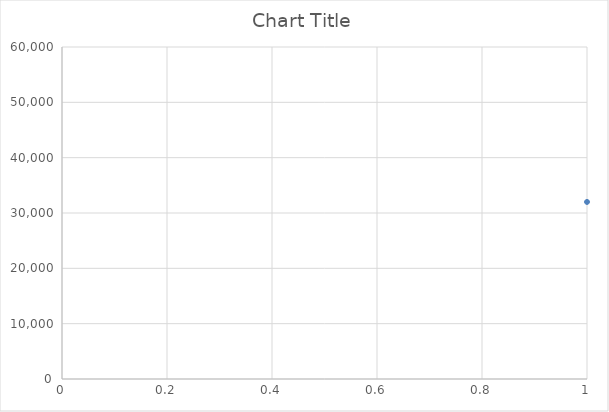
| Category | Series 0 |
|---|---|
| 0 | 32000 |
| 1 | 32200 |
| 2 | 30000 |
| 3 | 32600 |
| 4 | 32800 |
| 5 | 30800 |
| 6 | 41500 |
| 7 | 41000 |
| 8 | 41500 |
| 9 | 41000 |
| 10 | 50500 |
| 11 | 31800 |
| 12 | 31400 |
| 13 | 31000 |
| 14 | 31800 |
| 15 | 42000 |
| 16 | 43500 |
| 17 | 31600 |
| 18 | 31600 |
| 19 | 31000 |
| 20 | 31600 |
| 21 | 31800 |
| 22 | 31400 |
| 23 | 31000 |
| 24 | 31800 |
| 25 | 42500 |
| 26 | 44500 |
| 27 | 42000 |
| 28 | 43500 |
| 29 | 9800 |
| 30 | 9800 |
| 31 | 12000 |
| 32 | 18000 |
| 33 | 25000 |
| 34 | 23600 |
| 35 | 24000 |
| 36 | 23800 |
| 37 | 24000 |
| 38 | 24000 |
| 39 | 24000 |
| 40 | 24000 |
| 41 | 23800 |
| 42 | 23800 |
| 43 | 23600 |
| 44 | 23200 |
| 45 | 23200 |
| 46 | 23000 |
| 47 | 22800 |
| 48 | 22800 |
| 49 | 22600 |
| 50 | 24000 |
| 51 | 24000 |
| 52 | 24000 |
| 53 | 24000 |
| 54 | 23400 |
| 55 | 23400 |
| 56 | 23600 |
| 57 | 23400 |
| 58 | 23400 |
| 59 | 23200 |
| 60 | 23200 |
| 61 | 23400 |
| 62 | 24000 |
| 63 | 23800 |
| 64 | 23800 |
| 65 | 23800 |
| 66 | 23800 |
| 67 | 23600 |
| 68 | 23400 |
| 69 | 23400 |
| 70 | 23200 |
| 71 | 23600 |
| 72 | 23400 |
| 73 | 23400 |
| 74 | 23200 |
| 75 | 23000 |
| 76 | 23000 |
| 77 | 23000 |
| 78 | 23000 |
| 79 | 23000 |
| 80 | 23000 |
| 81 | 23000 |
| 82 | 23000 |
| 83 | 22800 |
| 84 | 22800 |
| 85 | 22800 |
| 86 | 22800 |
| 87 | 22800 |
| 88 | 22800 |
| 89 | 23000 |
| 90 | 23000 |
| 91 | 23000 |
| 92 | 23000 |
| 93 | 23000 |
| 94 | 23000 |
| 95 | 23400 |
| 96 | 23400 |
| 97 | 23400 |
| 98 | 23400 |
| 99 | 23200 |
| 100 | 23200 |
| 101 | 23200 |
| 102 | 23000 |
| 103 | 23000 |
| 104 | 23400 |
| 105 | 23200 |
| 106 | 23200 |
| 107 | 23200 |
| 108 | 23200 |
| 109 | 23200 |
| 110 | 23200 |
| 111 | 23200 |
| 112 | 23000 |
| 113 | 23200 |
| 114 | 23000 |
| 115 | 23000 |
| 116 | 23200 |
| 117 | 23200 |
| 118 | 33400 |
| 119 | 35404 |
| 120 | 35738 |
| 121 | 33400 |
| 122 | 35000 |
| 123 | 33600 |
| 124 | 33200 |
| 125 | 33000 |
| 126 | 32800 |
| 127 | 34200 |
| 128 | 34000 |
| 129 | 33600 |
| 130 | 35200 |
| 131 | 34800 |
| 132 | 34600 |
| 133 | 33800 |
| 134 | 33600 |
| 135 | 33800 |
| 136 | 33600 |
| 137 | 33400 |
| 138 | 34000 |
| 139 | 34200 |
| 140 | 34000 |
| 141 | 33800 |
| 142 | 34000 |
| 143 | 34000 |
| 144 | 33800 |
| 145 | 34000 |
| 146 | 34000 |
| 147 | 33600 |
| 148 | 33600 |
| 149 | 33600 |
| 150 | 32800 |
| 151 | 33600 |
| 152 | 33600 |
| 153 | 33200 |
| 154 | 33200 |
| 155 | 33200 |
| 156 | 33200 |
| 157 | 33200 |
| 158 | 33200 |
| 159 | 34200 |
| 160 | 34200 |
| 161 | 33800 |
| 162 | 33800 |
| 163 | 33800 |
| 164 | 34000 |
| 165 | 33800 |
| 166 | 33800 |
| 167 | 33800 |
| 168 | 33800 |
| 169 | 33800 |
| 170 | 34000 |
| 171 | 34000 |
| 172 | 34000 |
| 173 | 34000 |
| 174 | 33800 |
| 175 | 33800 |
| 176 | 33800 |
| 177 | 33800 |
| 178 | 33800 |
| 179 | 33800 |
| 180 | 33800 |
| 181 | 45500 |
| 182 | 46500 |
| 183 | 46000 |
| 184 | 45500 |
| 185 | 45500 |
| 186 | 46000 |
| 187 | 46000 |
| 188 | 46000 |
| 189 | 55500 |
| 190 | 10000 |
| 191 | 12000 |
| 192 | 55500 |
| 193 | 33400 |
| 194 | 45500 |
| 195 | 23600 |
| 196 | 24000 |
| 197 | 11800 |
| 198 | 10900 |
| 199 | 18000 |
| 200 | 18000 |
| 201 | 18000 |
| 202 | 19000 |
| 203 | 19000 |
| 204 | 36000 |
| 205 | 36000 |
| 206 | 48000 |
| 207 | 48000 |
| 208 | 23000 |
| 209 | 23000 |
| 210 | 28000 |
| 211 | 28000 |
| 212 | 23600 |
| 213 | 24000 |
| 214 | 23800 |
| 215 | 24000 |
| 216 | 24000 |
| 217 | 24000 |
| 218 | 24000 |
| 219 | 23800 |
| 220 | 23800 |
| 221 | 23600 |
| 222 | 23200 |
| 223 | 23200 |
| 224 | 23000 |
| 225 | 22800 |
| 226 | 22800 |
| 227 | 22600 |
| 228 | 24000 |
| 229 | 24000 |
| 230 | 24000 |
| 231 | 24000 |
| 232 | 23400 |
| 233 | 23400 |
| 234 | 23600 |
| 235 | 23400 |
| 236 | 23400 |
| 237 | 23200 |
| 238 | 23200 |
| 239 | 23400 |
| 240 | 24000 |
| 241 | 23800 |
| 242 | 23800 |
| 243 | 23800 |
| 244 | 23800 |
| 245 | 23600 |
| 246 | 23400 |
| 247 | 23400 |
| 248 | 23200 |
| 249 | 23600 |
| 250 | 23400 |
| 251 | 23400 |
| 252 | 23200 |
| 253 | 23000 |
| 254 | 23000 |
| 255 | 23000 |
| 256 | 23000 |
| 257 | 23000 |
| 258 | 23000 |
| 259 | 23000 |
| 260 | 23000 |
| 261 | 22800 |
| 262 | 22800 |
| 263 | 22800 |
| 264 | 22800 |
| 265 | 22800 |
| 266 | 22800 |
| 267 | 23000 |
| 268 | 23000 |
| 269 | 23000 |
| 270 | 23000 |
| 271 | 23000 |
| 272 | 23000 |
| 273 | 23400 |
| 274 | 23400 |
| 275 | 23400 |
| 276 | 23400 |
| 277 | 23200 |
| 278 | 23200 |
| 279 | 23200 |
| 280 | 23000 |
| 281 | 23000 |
| 282 | 23400 |
| 283 | 23200 |
| 284 | 23200 |
| 285 | 23200 |
| 286 | 23200 |
| 287 | 23200 |
| 288 | 23200 |
| 289 | 23200 |
| 290 | 23000 |
| 291 | 23200 |
| 292 | 23000 |
| 293 | 23000 |
| 294 | 23200 |
| 295 | 23200 |
| 296 | 23200 |
| 297 | 33400 |
| 298 | 35404 |
| 299 | 35738 |
| 300 | 33400 |
| 301 | 35000 |
| 302 | 33600 |
| 303 | 33200 |
| 304 | 33000 |
| 305 | 32800 |
| 306 | 34200 |
| 307 | 34000 |
| 308 | 33600 |
| 309 | 35200 |
| 310 | 34800 |
| 311 | 34600 |
| 312 | 33800 |
| 313 | 33600 |
| 314 | 33800 |
| 315 | 33600 |
| 316 | 33400 |
| 317 | 34000 |
| 318 | 34200 |
| 319 | 34000 |
| 320 | 33800 |
| 321 | 34000 |
| 322 | 34000 |
| 323 | 33800 |
| 324 | 34000 |
| 325 | 34000 |
| 326 | 33600 |
| 327 | 33600 |
| 328 | 33600 |
| 329 | 32800 |
| 330 | 33600 |
| 331 | 33600 |
| 332 | 33200 |
| 333 | 33200 |
| 334 | 33200 |
| 335 | 33200 |
| 336 | 33200 |
| 337 | 33200 |
| 338 | 34200 |
| 339 | 34200 |
| 340 | 33800 |
| 341 | 33800 |
| 342 | 33800 |
| 343 | 34000 |
| 344 | 33800 |
| 345 | 33800 |
| 346 | 33800 |
| 347 | 33800 |
| 348 | 33800 |
| 349 | 34000 |
| 350 | 34000 |
| 351 | 34000 |
| 352 | 34000 |
| 353 | 33800 |
| 354 | 33800 |
| 355 | 33800 |
| 356 | 33800 |
| 357 | 33800 |
| 358 | 33800 |
| 359 | 33800 |
| 360 | 45500 |
| 361 | 46500 |
| 362 | 46000 |
| 363 | 45500 |
| 364 | 45500 |
| 365 | 46000 |
| 366 | 46000 |
| 367 | 46000 |
| 368 | 55500 |
| 369 | 19000 |
| 370 | 24000 |
| 371 | 18000 |
| 372 | 10000 |
| 373 | 12000 |
| 374 | 9000 |
| 375 | 13000 |
| 376 | 19000 |
| 377 | 10900 |
| 378 | 11800 |
| 379 | 24000 |
| 380 | 18000 |
| 381 | 12000 |
| 382 | 16000 |
| 383 | 18000 |
| 384 | 12000 |
| 385 | 14400 |
| 386 | 18000 |
| 387 | 21600 |
| 388 | 25400 |
| 389 | 18900 |
| 390 | 24000 |
| 391 | 18295 |
| 392 | 18056 |
| 393 | 13679 |
| 394 | 10089 |
| 395 | 10942 |
| 396 | 18940 |
| 397 | 24000 |
| 398 | 10000 |
| 399 | 13500 |
| 400 | 16200 |
| 401 | 21600 |
| 402 | 23600 |
| 403 | 35000 |
| 404 | 45500 |
| 405 | 50000 |
| 406 | 23400 |
| 407 | 11000 |
| 408 | 13000 |
| 409 | 8806.37 |
| 410 | 10900 |
| 411 | 11800 |
| 412 | 24000 |
| 413 | 10800 |
| 414 | 13300 |
| 415 | 27000 |
| 416 | 13600 |
| 417 | 24000 |
| 418 | 23250 |
| 419 | 12000 |
| 420 | 16000 |
| 421 | 12000 |
| 422 | 12000 |
| 423 | 16000 |
| 424 | 16000 |